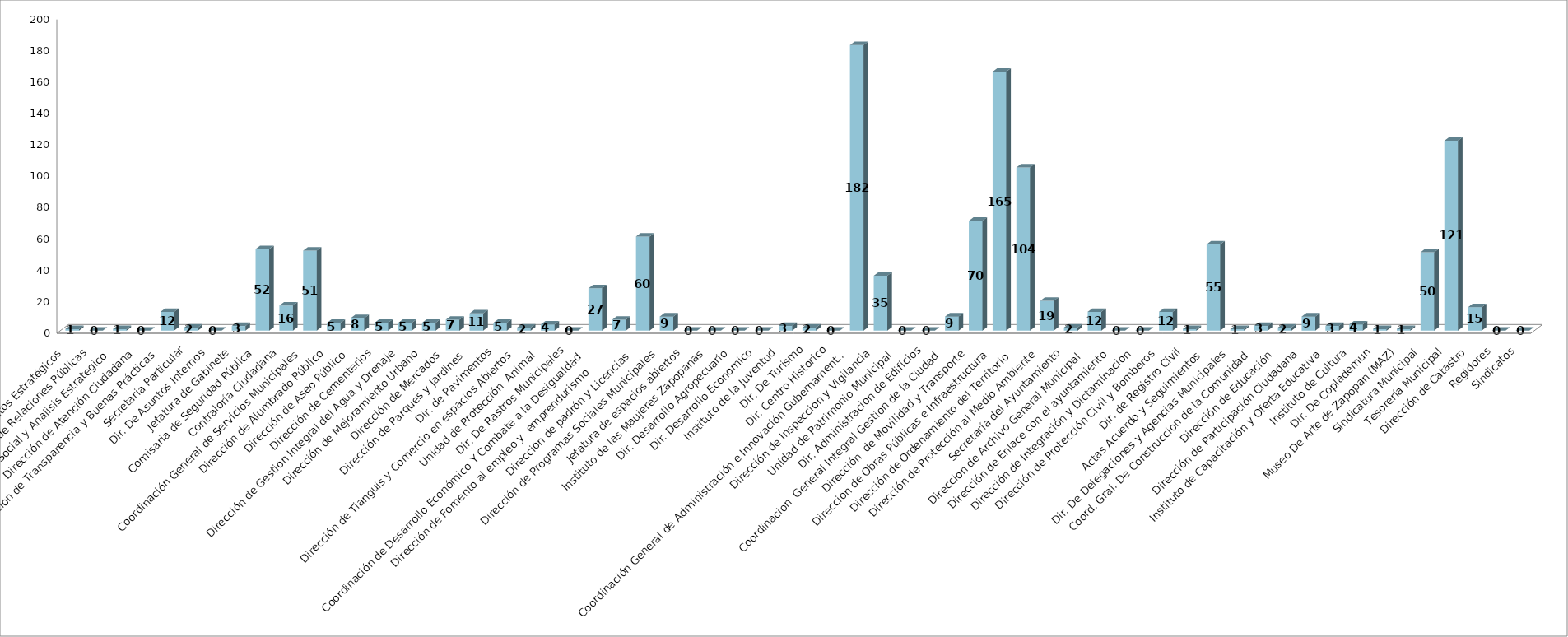
| Category | Series 0 | Series 1 |
|---|---|---|
| Area de Proyectos Estratégicos |  | 1 |
| Área de Relaciones Públicas |  | 0 |
| Comunicación Social y Analisis Estrategico  |  | 1 |
| Dirección de Atención Ciudadana |  | 0 |
| Dirección de Transparencia y Buenas Prácticas |  | 12 |
| Secretaria Particular |  | 2 |
| Dir. De Asuntos Internos |  | 0 |
| Jefatura de Gabinete |  | 3 |
| Comisaria de Seguridad Pública |  | 52 |
| Contraloría Ciudadana |  | 16 |
| Coordinación General de Servicios Municipales |  | 51 |
| Dirección de Alumbrado Público |  | 5 |
| Dirección de Aseo Público  |  | 8 |
| Dirección de Cementerios |  | 5 |
| Dirección de Gestión Integral del Agua y Drenaje |  | 5 |
| Dirección de Mejoramiento Urbano |  | 5 |
| Dirección de Mercados  |  | 7 |
| Dirección de Parques y Jardines  |  | 11 |
| Dir. de Pavimentos |  | 5 |
| Dirección de Tianguis y Comercio en espacios Abiertos |  | 2 |
| Unidad de Protección  Animal  |  | 4 |
| Dir. De Rastros Municipales |  | 0 |
| Coordinación de Desarrollo Económico Y Combate a la Desigualdad |  | 27 |
| Dirección de Fomento al empleo y  emprendurismo         |  | 7 |
| Dirección de padrón y Licencias  |  | 60 |
| Dirección de Programas Sociales Municipales |  | 9 |
| Jefatura de espacios abiertos |  | 0 |
| Instituto de las Maujeres Zapopanas |  | 0 |
|  Dir. Desarrollo Agropecuario |  | 0 |
| Dir. Desarrollo Economico |  | 0 |
| Instituto de la Juventud |  | 3 |
| Dir. De Turismo |  | 2 |
| Dir. Centro Historico |  | 0 |
| Coordinación General de Administración e Innovación Gubernamental |  | 182 |
| Dirección de Inspección y Vigilancia |  | 35 |
| Unidad de Patrimonio Municipal  |  | 0 |
| Dir. Administracion de Edificios |  | 0 |
| Coordinacion  General Integral Gestion de la Ciudad |  | 9 |
| Dirección  de Movilidad y Transporte |  | 70 |
| Dirección de Obras Públicas e Infraestructura |  | 165 |
| Dirección de Ordenamiento del Territorio  |  | 104 |
| Dirección de Protección al Medio Ambiente  |  | 19 |
| Secretaría del Ayuntamiento |  | 2 |
| Dirección de Archivo General Municipal  |  | 12 |
| Dirección de Enlace con el ayuntamiento |  | 0 |
| Dirección de Integración y Dictaminación |  | 0 |
| Dirección de Protección Civil y Bomberos |  | 12 |
| Dir. de Registro Civil |  | 1 |
| Actas Acuerdo y Seguimientos  |  | 55 |
| Dir. De Delegaciones y Agencias Municipales |  | 1 |
| Coord. Gral. De Construccion de la Comunidad |  | 3 |
| Dirección de Educación  |  | 2 |
| Dirección de Participación Ciudadana |  | 9 |
| Instituto de Capacitación y Oferta Educativa |  | 3 |
| Instituto de Cultura  |  | 4 |
| Dir. De Coplademun |  | 1 |
| Museo De Arte de Zapopan (MAZ) |  | 1 |
| Sindicatura Municipal |  | 50 |
| Tesorería Municipal |  | 121 |
| Dirección de Catastro |  | 15 |
| Regidores |  | 0 |
| Sindicatos |  | 0 |